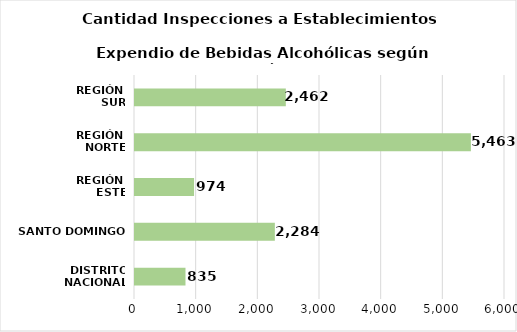
| Category | Series 0 |
|---|---|
| DISTRITO NACIONAL | 835 |
| SANTO DOMINGO | 2284 |
| REGIÓN 
ESTE | 974 |
| REGIÓN 
NORTE | 5463 |
| REGIÓN 
SUR | 2462 |